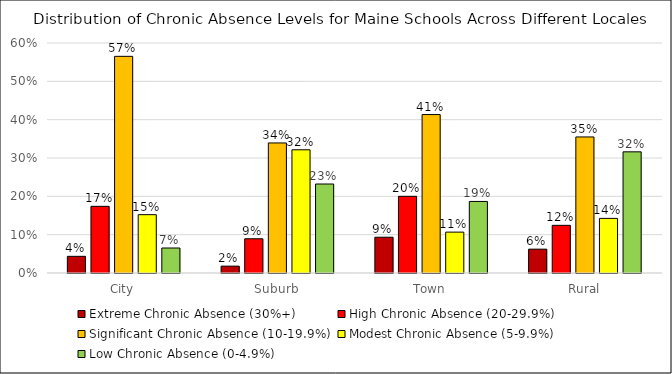
| Category | Extreme Chronic Absence (30%+) | High Chronic Absence (20-29.9%) | Significant Chronic Absence (10-19.9%) | Modest Chronic Absence (5-9.9%) | Low Chronic Absence (0-4.9%) |
|---|---|---|---|---|---|
| City | 0.043 | 0.174 | 0.565 | 0.152 | 0.065 |
| Suburb | 0.018 | 0.089 | 0.339 | 0.321 | 0.232 |
| Town | 0.093 | 0.2 | 0.413 | 0.107 | 0.187 |
| Rural | 0.062 | 0.124 | 0.355 | 0.142 | 0.316 |